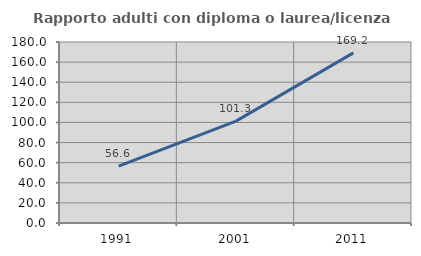
| Category | Rapporto adulti con diploma o laurea/licenza media  |
|---|---|
| 1991.0 | 56.585 |
| 2001.0 | 101.279 |
| 2011.0 | 169.206 |